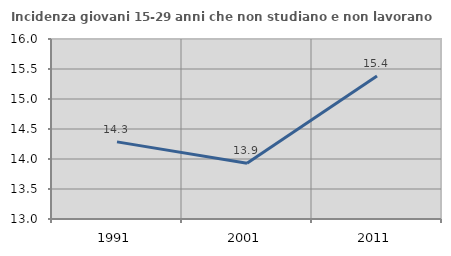
| Category | Incidenza giovani 15-29 anni che non studiano e non lavorano  |
|---|---|
| 1991.0 | 14.286 |
| 2001.0 | 13.928 |
| 2011.0 | 15.385 |